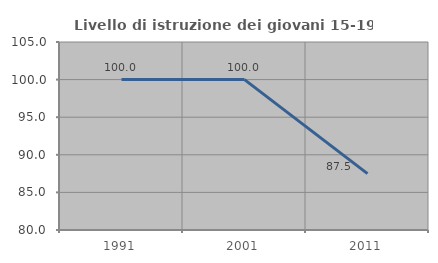
| Category | Livello di istruzione dei giovani 15-19 anni |
|---|---|
| 1991.0 | 100 |
| 2001.0 | 100 |
| 2011.0 | 87.5 |